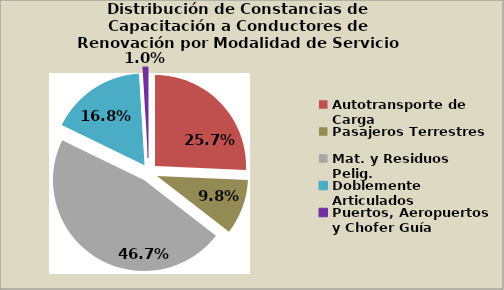
| Category | Series 0 |
|---|---|
| Autotransporte de Carga | 25.688 |
| Pasajeros Terrestres | 9.771 |
| Mat. y Residuos Pelig. | 46.7 |
| Doblemente Articulados | 16.807 |
| Puertos, Aeropuertos y Chofer Guía | 0.966 |